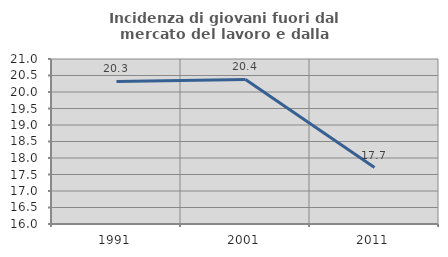
| Category | Incidenza di giovani fuori dal mercato del lavoro e dalla formazione  |
|---|---|
| 1991.0 | 20.32 |
| 2001.0 | 20.38 |
| 2011.0 | 17.71 |